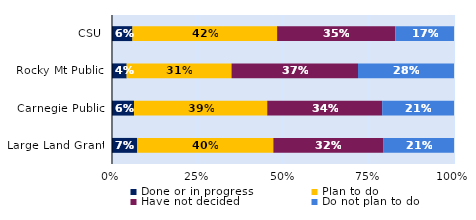
| Category | Done or in progress | Plan to do | Have not decided | Do not plan to do |
|---|---|---|---|---|
| CSU | 0.06 | 0.423 | 0.346 | 0.172 |
| Rocky Mt Public | 0.043 | 0.307 | 0.37 | 0.281 |
| Carnegie Public | 0.064 | 0.39 | 0.336 | 0.21 |
| Large Land Grant | 0.074 | 0.398 | 0.322 | 0.206 |